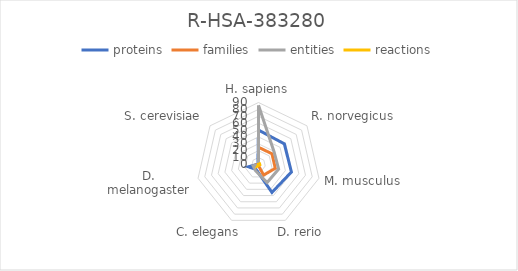
| Category | proteins | families | entities | reactions |
|---|---|---|---|---|
| H. sapiens | 50 | 25 | 86 | 2 |
| R. norvegicus | 48 | 25 | 29 | 2 |
| M. musculus | 49 | 25 | 30 | 2 |
| D. rerio | 45 | 17 | 29 | 2 |
| C. elegans | 8 | 1 | 10 | 2 |
| D. melanogaster | 15 | 5 | 8 | 2 |
| S. cerevisiae | 1 | 0 | 0 | 0 |